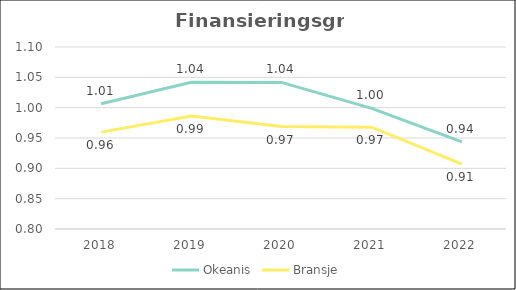
| Category | Okeanis | Bransje |
|---|---|---|
| 2018 | 1.006 | 0.96 |
| 2019 | 1.042 | 0.986 |
| 2020 | 1.042 | 0.969 |
| 2021 | 0.999 | 0.968 |
| 2022 | 0.944 | 0.907 |